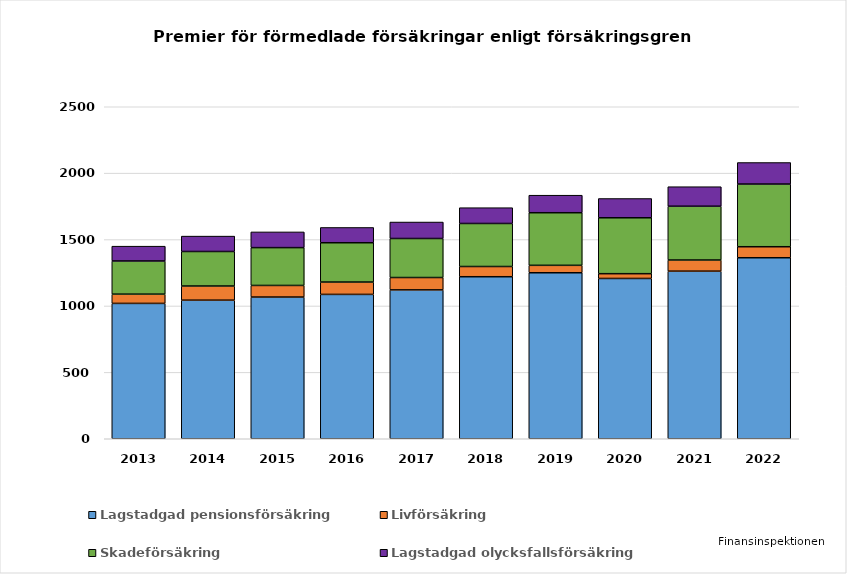
| Category | Lagstadgad pensionsförsäkring | Livförsäkring | Skadeförsäkring | Lagstadgad olycksfallsförsäkring |
|---|---|---|---|---|
| 2013.0 | 1019.216 | 69.648 | 249.823 | 111.515 |
| 2014.0 | 1043.573 | 106.619 | 259.835 | 115.957 |
| 2015.0 | 1067.062 | 87.285 | 284.943 | 118.153 |
| 2016.0 | 1087 | 93 | 296 | 115 |
| 2017.0 | 1121 | 93 | 294 | 124 |
| 2018.0 | 1220 | 77 | 324 | 119 |
| 2019.0 | 1250 | 56 | 396 | 132 |
| 2020.0 | 1207 | 36 | 421 | 145 |
| 2021.0 | 1262 | 84 | 405 | 147 |
| 2022.0 | 1363 | 83 | 472 | 162 |